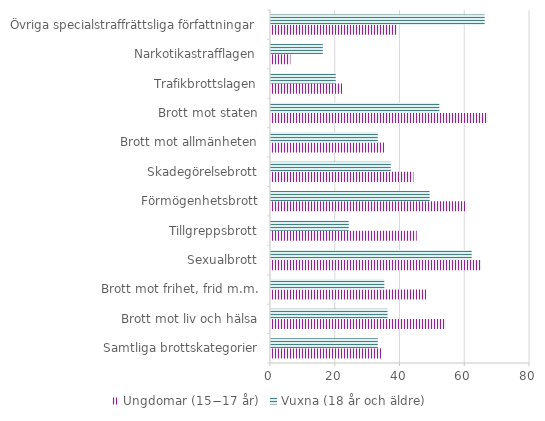
| Category | Ungdomar (15−17 år)  | Vuxna (18 år och äldre)  |
|---|---|---|
| Samtliga brottskategorier | 34 | 33 |
| Brott mot liv och hälsa | 54 | 36 |
| Brott mot frihet, frid m.m. | 48 | 35 |
| Sexualbrott | 65 | 62 |
| Tillgreppsbrott | 45 | 24 |
| Förmögenhetsbrott | 60 | 49 |
| Skadegörelsebrott | 44 | 37 |
| Brott mot allmänheten | 35 | 33 |
| Brott mot staten | 67 | 52 |
| Trafikbrottslagen | 22 | 20 |
| Narkotikastrafflagen | 6 | 16 |
| Övriga specialstraffrättsliga författningar | 39 | 66 |